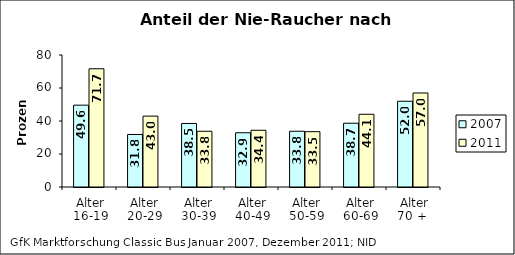
| Category | 2007 | 2011 |
|---|---|---|
| Alter
16-19 | 49.593 | 71.667 |
| Alter
20-29 | 31.837 | 42.955 |
| Alter
30-39 | 38.509 | 33.779 |
| Alter
40-49 | 32.88 | 34.383 |
| Alter
50-59 | 33.788 | 33.529 |
| Alter
60-69 | 38.65 | 44.068 |
| Alter
70 +  | 51.974 | 56.977 |